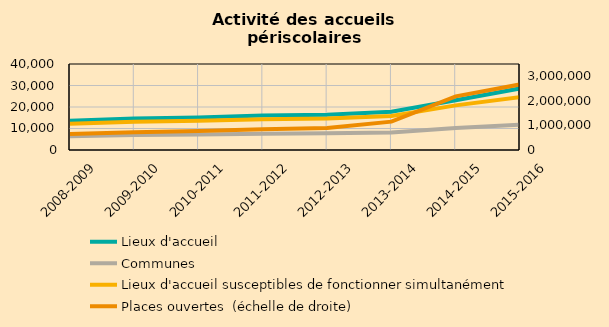
| Category | Lieux d'accueil | Communes | Lieux d'accueil susceptibles de fonctionner simultanément |
|---|---|---|---|
| 2008-2009 | 13563 | 6423 | 12263 |
| 2009-2010 | 14611 | 7016 | 13148 |
| 2010-2011 | 15150 | 7252 | 13597 |
| 2011-2012 | 16005 | 7570 | 14338 |
| 2012-2013 | 16356 | 7784 | 14663 |
| 2013-2014 | 17759 | 8127 | 15852 |
| 2014-2015 | 23167 | 10216 | 20751 |
| 2015-2016 | 28641 | 11768 | 24574 |